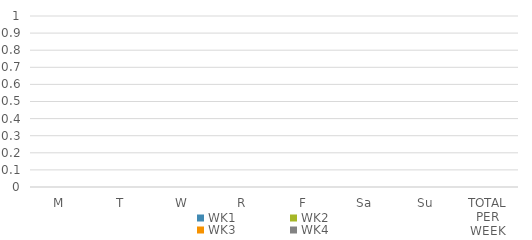
| Category | WK1 | WK2 | WK3 | WK4 |
|---|---|---|---|---|
| M | 0 | 0 | 0 | 0 |
| T | 0 | 0 | 0 | 0 |
| W | 0 | 0 | 0 | 0 |
| R | 0 | 0 | 0 | 0 |
| F | 0 | 0 | 0 | 0 |
| Sa | 0 | 0 | 0 | 0 |
| Su | 0 | 0 | 0 | 0 |
| TOTAL PER WEEK | 0 | 0 | 0 | 0 |